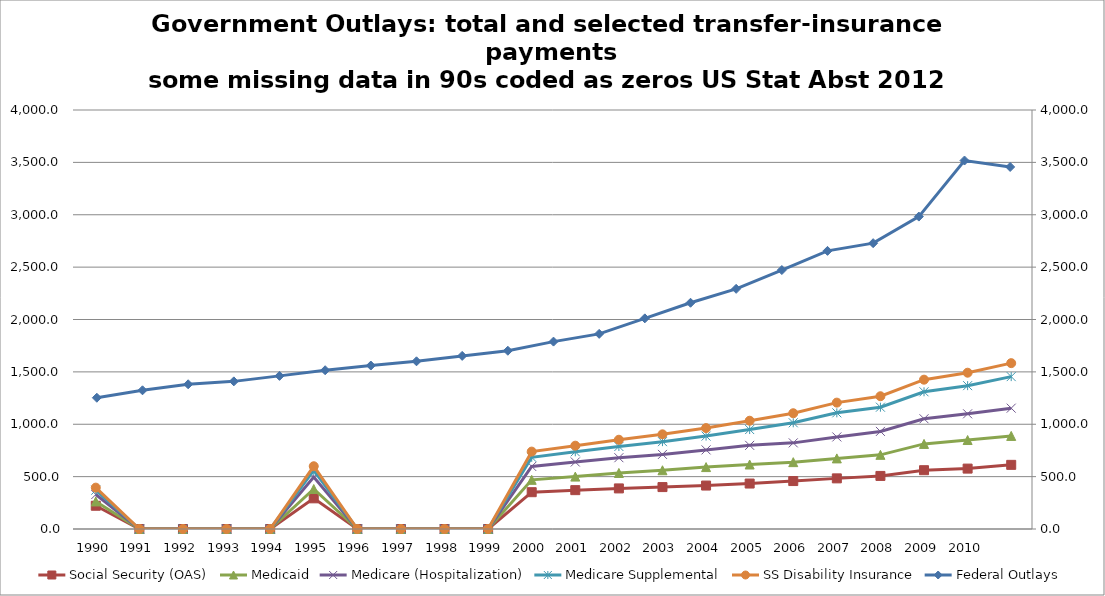
| Category | Social Security (OAS) | Medicaid | Medicare (Hospitalization) | Medicare Supplemental | SS Disability Insurance |
|---|---|---|---|---|---|
| 1990 | 221.926 | 41.103 | 65.912 | 41.498 | 24.423 |
| 1991 | 0 | 0 | 0 | 0 | 0 |
| 1992 | 0 | 0 | 0 | 0 | 0 |
| 1993 | 0 | 0 | 0 | 0 | 0 |
| 1994 | 0 | 0 | 0 | 0 | 0 |
| 1995 | 292.669 | 89.07 | 113.583 | 63.491 | 40.316 |
| 1996 | 0 | 0 | 0 | 0 | 0 |
| 1997 | 0 | 0 | 0 | 0 | 0 |
| 1998 | 0 | 0 | 0 | 0 | 0 |
| 1999 | 0 | 0 | 0 | 0 | 0 |
| 2000 | 351.432 | 117.921 | 127.933 | 87.212 | 54.435 |
| 2001 | 370.95 | 129.374 | 139.356 | 97.526 | 58.231 |
| 2002 | 387.463 | 147.512 | 145.566 | 107.108 | 64.423 |
| 2003 | 400.179 | 160.693 | 151.25 | 121.81 | 70.014 |
| 2004 | 414.788 | 176.231 | 164.078 | 131.842 | 76.482 |
| 2005 | 433.956 | 181.72 | 182.842 | 150.982 | 84.152 |
| 2006 | 457.726 | 180.625 | 183.903 | 191.674 | 91.15 |
| 2007 | 483.32 | 190.624 | 204.865 | 230.118 | 97.499 |
| 2008 | 506.625 | 201.426 | 223.631 | 231.063 | 104.743 |
| 2009 | 561.37 | 250.924 | 240.027 | 257.642 | 115.533 |
| 2010 | 576.578 | 272.771 | 250.223 | 268.945 | 123.507 |